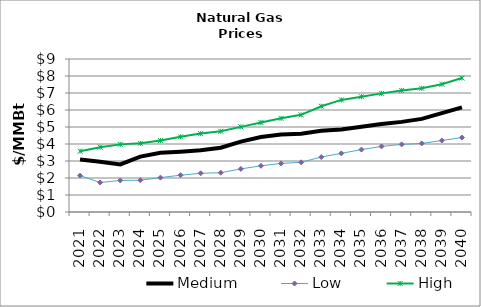
| Category | Medium | Low | High |
|---|---|---|---|
| 2021.0 | 3.09 | 2.141 | 3.578 |
| 2022.0 | 2.959 | 1.737 | 3.815 |
| 2023.0 | 2.802 | 1.855 | 3.978 |
| 2024.0 | 3.259 | 1.868 | 4.04 |
| 2025.0 | 3.489 | 2.023 | 4.203 |
| 2026.0 | 3.547 | 2.165 | 4.422 |
| 2027.0 | 3.63 | 2.277 | 4.613 |
| 2028.0 | 3.782 | 2.31 | 4.749 |
| 2029.0 | 4.142 | 2.534 | 5.009 |
| 2030.0 | 4.406 | 2.717 | 5.264 |
| 2031.0 | 4.554 | 2.858 | 5.51 |
| 2032.0 | 4.601 | 2.925 | 5.714 |
| 2033.0 | 4.773 | 3.233 | 6.222 |
| 2034.0 | 4.855 | 3.449 | 6.594 |
| 2035.0 | 5.018 | 3.671 | 6.781 |
| 2036.0 | 5.174 | 3.857 | 6.979 |
| 2037.0 | 5.301 | 3.977 | 7.153 |
| 2038.0 | 5.476 | 4.034 | 7.275 |
| 2039.0 | 5.816 | 4.205 | 7.516 |
| 2040.0 | 6.157 | 4.379 | 7.881 |